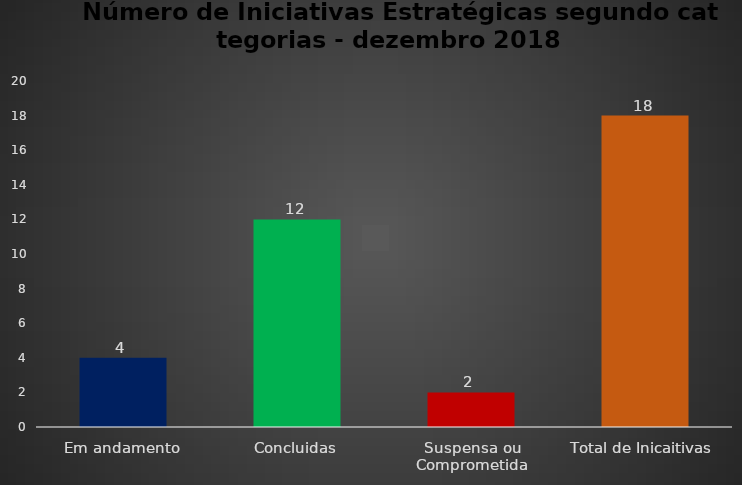
| Category | Series 0 |
|---|---|
| Em andamento | 4 |
| Concluidas | 12 |
| Suspensa ou Comprometida | 2 |
| Total de Inicaitivas  | 18 |